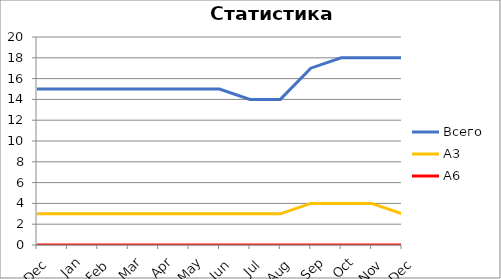
| Category | Всего | А3 | A6 |
|---|---|---|---|
| 0 | 15 | 3 | 0 |
| 1 | 15 | 3 | 0 |
| 2 | 15 | 3 | 0 |
| 3 | 15 | 3 | 0 |
| 4 | 15 | 3 | 0 |
| 5 | 15 | 3 | 0 |
| 6 | 15 | 3 | 0 |
| 7 | 14 | 3 | 0 |
| 8 | 14 | 3 | 0 |
| 9 | 17 | 4 | 0 |
| 10 | 18 | 4 | 0 |
| 11 | 18 | 4 | 0 |
| 12 | 18 | 3 | 0 |